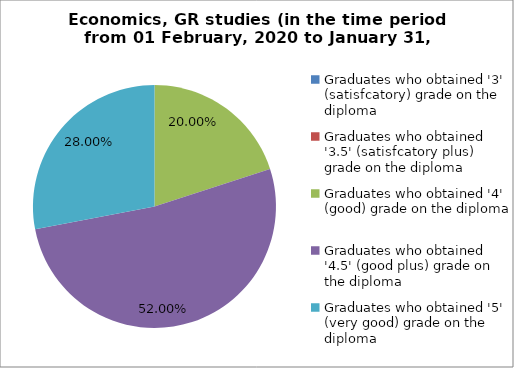
| Category | Series 0 |
|---|---|
| Graduates who obtained '3' (satisfcatory) grade on the diploma | 0 |
| Graduates who obtained '3.5' (satisfcatory plus) grade on the diploma | 0 |
| Graduates who obtained '4' (good) grade on the diploma | 20 |
| Graduates who obtained '4.5' (good plus) grade on the diploma | 52 |
| Graduates who obtained '5' (very good) grade on the diploma | 28 |